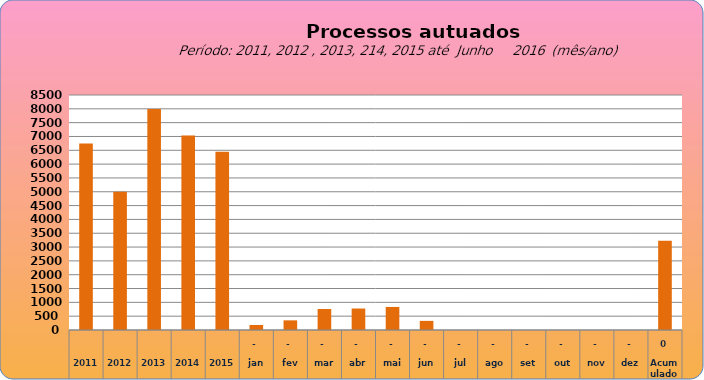
| Category | 6749 |
|---|---|
| 2011 | 6749 |
| 2012 | 4997 |
| 2013 | 7990 |
| 2014 | 7034 |
| 2015 | 6446 |
| jan | 182 |
| fev | 349 |
| mar | 760 |
| abr | 777 |
| mai | 834 |
| jun | 330 |
| jul | 0 |
| ago | 0 |
| set | 0 |
| out | 0 |
| nov | 0 |
| dez | 0 |
| Acumulado
 | 3232 |